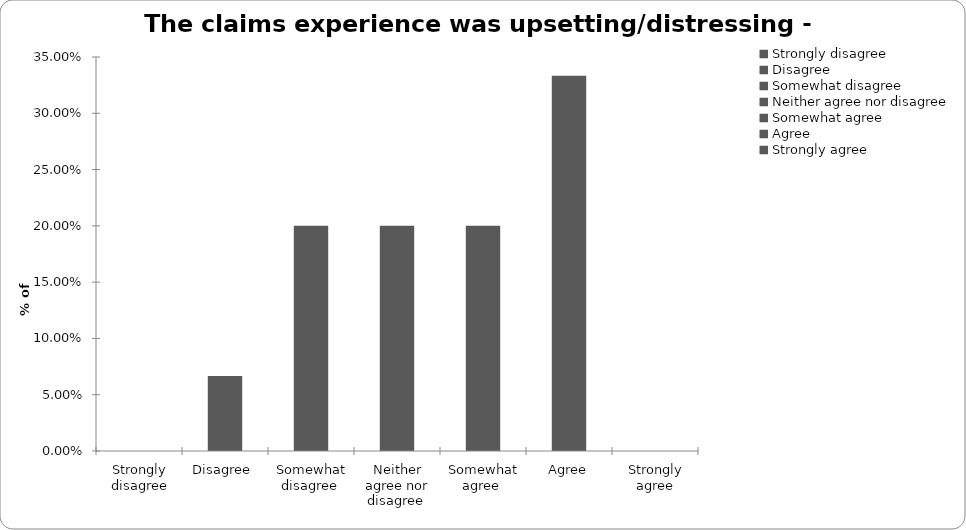
| Category | Series 2 |
|---|---|
| Strongly disagree | 0 |
| Disagree  | 0.067 |
| Somewhat disagree  | 0.2 |
| Neither agree nor disagree  | 0.2 |
| Somewhat agree  | 0.2 |
| Agree | 0.333 |
| Strongly agree | 0 |